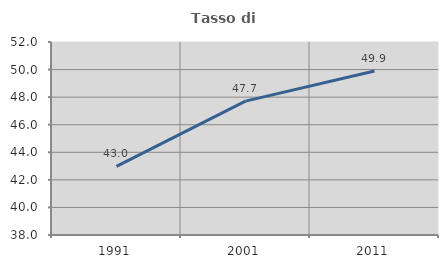
| Category | Tasso di occupazione   |
|---|---|
| 1991.0 | 42.98 |
| 2001.0 | 47.71 |
| 2011.0 | 49.899 |